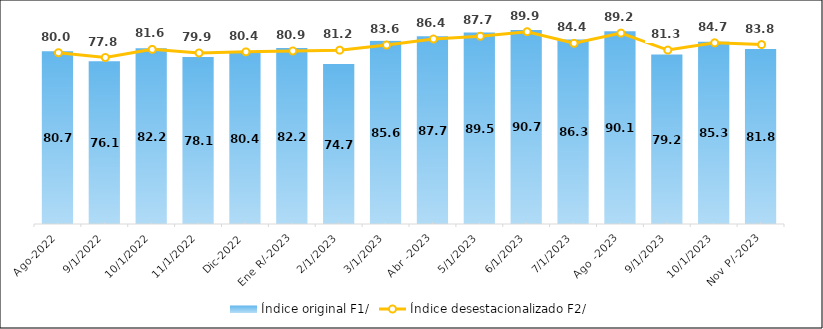
| Category |  Índice original F1/  |
|---|---|
| Ago-2022 | 80.723 |
| Sep-2022 | 76.095 |
| Oct-2022 | 82.166 |
| Nov -2022 | 78.09 |
| Dic-2022 | 80.364 |
| Ene R/-2023 | 82.238 |
| Feb-2023 | 74.73 |
| Mar -2023 | 85.584 |
| Abr -2023 | 87.695 |
| May -2023 | 89.526 |
| Jun-2023 | 90.661 |
| Jul-2023 | 86.253 |
| Ago -2023 | 90.092 |
| Sep-2023 | 79.206 |
| Oct-2023 | 85.268 |
| Nov P/-2023 | 81.829 |